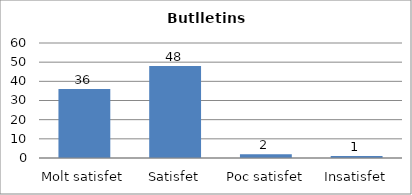
| Category | Series 0 |
|---|---|
| Molt satisfet | 36 |
| Satisfet | 48 |
| Poc satisfet | 2 |
| Insatisfet | 1 |